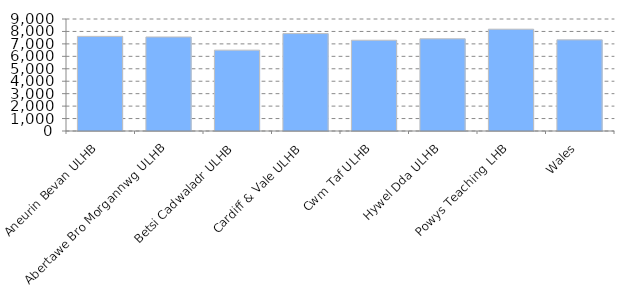
| Category | Average patient list size per practice |
|---|---|
| Aneurin Bevan ULHB | 7603.425 |
| Abertawe Bro Morgannwg ULHB | 7555.247 |
| Betsi Cadwaladr ULHB | 6498.44 |
| Cardiff & Vale ULHB | 7827.318 |
| Cwm Taf ULHB | 7294.667 |
| Hywel Dda ULHB | 7409.245 |
| Powys Teaching LHB | 8181.529 |
| Wales | 7324.755 |